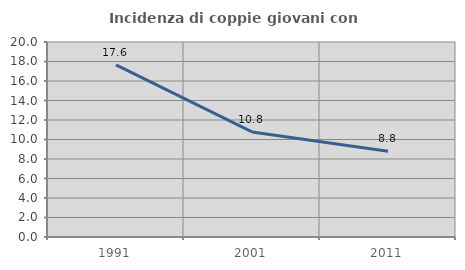
| Category | Incidenza di coppie giovani con figli |
|---|---|
| 1991.0 | 17.647 |
| 2001.0 | 10.776 |
| 2011.0 | 8.791 |